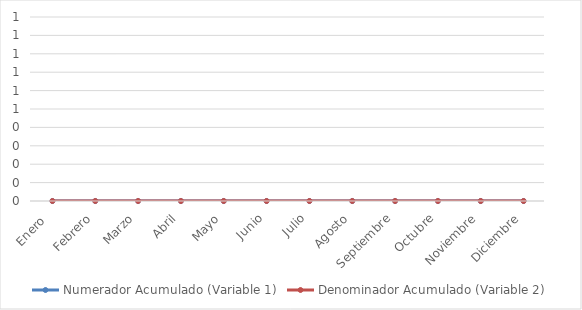
| Category | Numerador Acumulado (Variable 1) | Denominador Acumulado (Variable 2) |
|---|---|---|
| Enero  | 0 | 0 |
| Febrero | 0 | 0 |
| Marzo | 0 | 0 |
| Abril | 0 | 0 |
| Mayo | 0 | 0 |
| Junio | 0 | 0 |
| Julio | 0 | 0 |
| Agosto | 0 | 0 |
| Septiembre | 0 | 0 |
| Octubre | 0 | 0 |
| Noviembre | 0 | 0 |
| Diciembre | 0 | 0 |